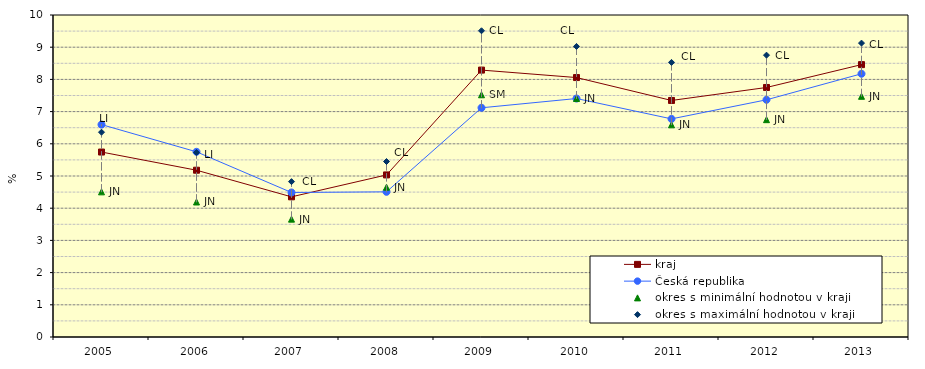
| Category | kraj | Česká republika | okres s minimální hodnotou v kraji | okres s maximální hodnotou v kraji |
|---|---|---|---|---|
| 2005.0 | 5.744 | 6.596 | 4.508 | 6.36 |
| 2006.0 | 5.18 | 5.751 | 4.193 | 5.731 |
| 2007.0 | 4.353 | 4.488 | 3.66 | 4.825 |
| 2008.0 | 5.033 | 4.508 | 4.653 | 5.45 |
| 2009.0 | 8.289 | 7.118 | 7.522 | 9.51 |
| 2010.0 | 8.057 | 7.406 | 7.406 | 9.024 |
| 2011.0 | 7.346 | 6.774 | 6.59 | 8.528 |
| 2012.0 | 7.749 | 7.367 | 6.749 | 8.753 |
| 2013.0 | 8.459 | 8.175 | 7.475 | 9.127 |